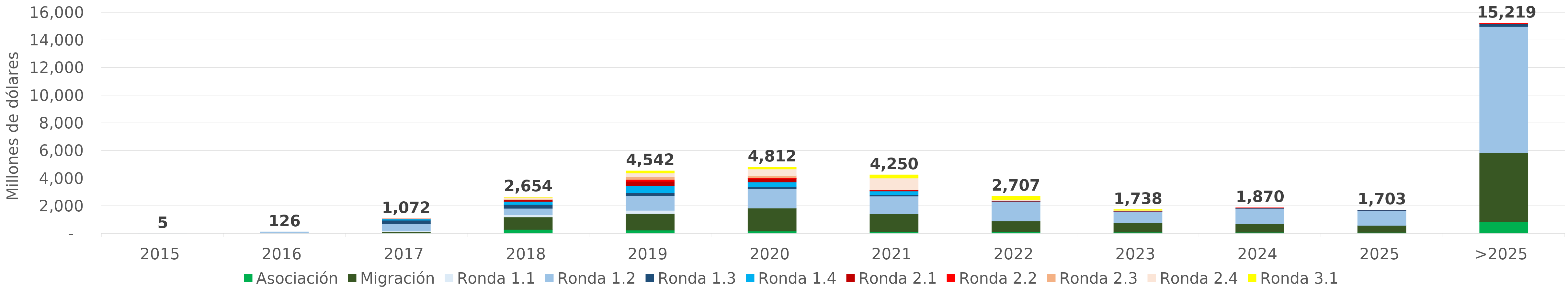
| Category | Asociación | Migración | Ronda 1.1 | Ronda 1.2 | Ronda 1.3 | Ronda 1.4 | Ronda 2.1 | Ronda 2.2 | Ronda 2.3 | Ronda 2.4 | Ronda 3.1 |
|---|---|---|---|---|---|---|---|---|---|---|---|
| 2015 | 0 | 0 | 4.573 | 0.236 | 0 | 0 | 0 | 0 | 0 | 0 | 0 |
| 2016 | 0 | 0 | 16.79 | 108.909 | 0 | 0 | 0 | 0 | 0 | 0 | 0 |
| 2017 | 50.877 | 65.422 | 76.429 | 533.486 | 231.789 | 93.443 | 18.851 | 1.29 | 0.72 | 0 | 0 |
| 2018 | 289.394 | 902.921 | 155.042 | 470.128 | 278.302 | 226.903 | 104.896 | 21.902 | 26.974 | 139.641 | 37.691 |
| 2019 | 241.207 | 1195.818 | 236.68 | 1049.68 | 207.126 | 540.649 | 302.09 | 133.009 | 199.161 | 270.262 | 166.186 |
| 2020 | 177.3 | 1658.785 | 6.736 | 1382.287 | 160.039 | 341.057 | 255.4 | 52.656 | 152.327 | 477.469 | 148.013 |
| 2021 | 111.804 | 1294.964 | 2.229 | 1293.069 | 88.66 | 274.593 | 68.406 | 24.359 | 1.68 | 847.746 | 242.801 |
| 2022 | 112.591 | 798.545 | 0 | 1363.556 | 40.604 | 10.69 | 23.744 | 30.043 | 0 | 82.428 | 244.664 |
| 2023 | 87.085 | 669.696 | 0 | 815.124 | 34.741 | 0.73 | 0 | 36.282 | 0 | 32.499 | 62.088 |
| 2024 | 79.455 | 613.256 | 0 | 1120.717 | 30.041 | 0 | 0 | 26.685 | 0 | 0 | 0 |
| 2025 | 75.288 | 512.631 | 0 | 1074.435 | 30.797 | 0 | 0 | 9.414 | 0 | 0 | 0 |
| >2025 | 859.226 | 4966.547 | 0 | 9146.403 | 225.326 | 0 | 0 | 21.146 | 0 | 0 | 0 |